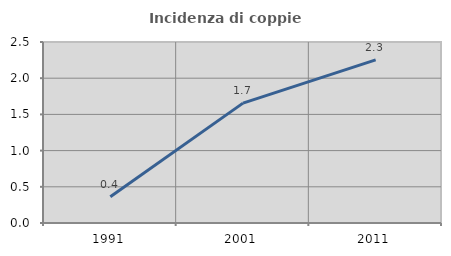
| Category | Incidenza di coppie miste |
|---|---|
| 1991.0 | 0.363 |
| 2001.0 | 1.656 |
| 2011.0 | 2.254 |